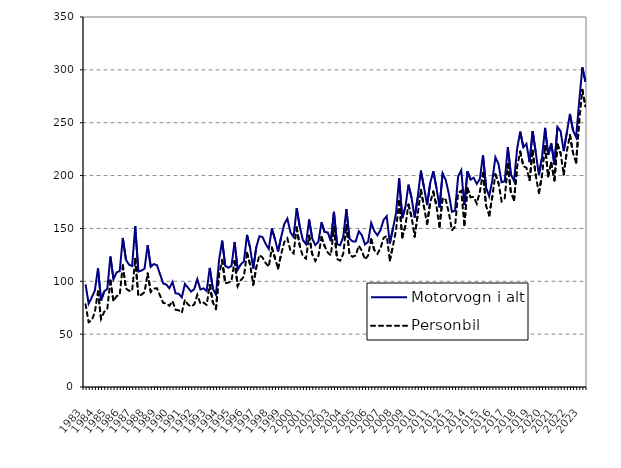
| Category | Motorvogn i alt | Personbil |
|---|---|---|
| 1983.0 | 97 | 78.3 |
| nan | 78.8 | 61.3 |
| nan | 84.8 | 63 |
| nan | 91.2 | 70.8 |
| 1984.0 | 112.2 | 90.4 |
| nan | 81.8 | 64.4 |
| nan | 90.4 | 71.1 |
| nan | 92.9 | 73.9 |
| 1985.0 | 123.4 | 100.8 |
| nan | 102 | 81.1 |
| nan | 108.4 | 86 |
| nan | 109.6 | 87.1 |
| 1986.0 | 141 | 115.2 |
| nan | 120.5 | 93.2 |
| nan | 115.7 | 91.1 |
| nan | 114.4 | 90.8 |
| 1987.0 | 152.2 | 121.3 |
| nan | 109.2 | 86.1 |
| nan | 110.1 | 87.3 |
| nan | 112 | 89.8 |
| 1988.0 | 134.1 | 107.5 |
| nan | 113.7 | 90 |
| nan | 116.3 | 93.1 |
| nan | 115.2 | 93.4 |
| 1989.0 | 106.6 | 86.4 |
| nan | 98 | 79.6 |
| nan | 96.9 | 79 |
| nan | 93.4 | 76.8 |
| 1990.0 | 99.4 | 81.3 |
| nan | 88.6 | 73.1 |
| nan | 88.2 | 72.5 |
| nan | 84.8 | 70.2 |
| 1991.0 | 97.5 | 82.4 |
| nan | 93.9 | 78 |
| nan | 90.2 | 76.1 |
| nan | 92.6 | 78.1 |
| 1992.0 | 102 | 87.1 |
| nan | 92.2 | 78.9 |
| nan | 93.3 | 79.9 |
| nan | 90.8 | 77.6 |
| 1993.0 | 112.6 | 96.5 |
| nan | 93 | 80.1 |
| nan | 87.5 | 73.6 |
| nan | 120.1 | 106.6 |
| 1994.0 | 138.4 | 120 |
| nan | 114.5 | 98.1 |
| nan | 112.8 | 98.8 |
| nan | 114.5 | 100.2 |
| 1995.0 | 137.2 | 119.3 |
| nan | 111 | 95.4 |
| nan | 115.9 | 101 |
| nan | 118.8 | 104.4 |
| 1996.0 | 143.9 | 126.9 |
| nan | 131.6 | 115.7 |
| nan | 112 | 96.7 |
| nan | 132.5 | 113.1 |
| 1997.0 | 142.6 | 124.8 |
| nan | 141.8 | 122.5 |
| nan | 135.4 | 117.3 |
| nan | 130.6 | 113.7 |
| 1998.0 | 150 | 131.9 |
| nan | 139.8 | 122 |
| nan | 128.1 | 112.1 |
| nan | 141.8 | 125.6 |
| 1999.0 | 154.2 | 137.1 |
| nan | 159.3 | 140.7 |
| nan | 146.3 | 128.7 |
| nan | 141.9 | 126.4 |
| 2000.0 | 169.1 | 150.9 |
| nan | 151.5 | 133.4 |
| nan | 139 | 123.5 |
| nan | 135.1 | 121.4 |
| 2001.0 | 158.5 | 143.1 |
| nan | 140.46 | 125.7 |
| nan | 134.24 | 119.2 |
| nan | 137.495 | 124.072 |
| 2002.0 | 155.814 | 141.724 |
| nan | 146.543 | 133.19 |
| nan | 146.231 | 127.141 |
| nan | 137.967 | 124.641 |
| 2003.0 | 165.679 | 150.811 |
| nan | 135.021 | 121.101 |
| nan | 134.111 | 119.491 |
| nan | 142.013 | 125.959 |
| 2004.0 | 168.309 | 153.043 |
| nan | 140.267 | 125.568 |
| nan | 137.77 | 123.121 |
| nan | 137.685 | 124.506 |
| 2005.0 | 147.311 | 133.756 |
| nan | 143.517 | 128.79 |
| nan | 134.783 | 120.571 |
| nan | 137.37 | 124.382 |
| 2006.0 | 155.213 | 139.728 |
| nan | 147.444 | 129.572 |
| nan | 143.451 | 126.006 |
| nan | 148.561 | 131.195 |
| 2007.0 | 158.1 | 141.084 |
| nan | 161.613 | 142.897 |
| nan | 135.821 | 119.753 |
| nan | 149.791 | 133.498 |
| 2008.0 | 164.642 | 148.614 |
| nan | 197.287 | 175.714 |
| nan | 159.718 | 141.407 |
| nan | 170.057 | 152.54 |
| 2009.0 | 191.38 | 172.559 |
| nan | 178.906 | 160.765 |
| nan | 160.234 | 142.312 |
| nan | 179.857 | 163.532 |
| 2010.0 | 204.636 | 186.507 |
| nan | 188.957 | 170.463 |
| nan | 172.077 | 154.156 |
| nan | 192.961 | 174.399 |
| 2011.0 | 204.005 | 184.86 |
| nan | 188.741 | 171.333 |
| nan | 169.934 | 151.694 |
| nan | 202.176 | 178.919 |
| 2012.0 | 195.829 | 177.072 |
| nan | 182.751 | 165.128 |
| nan | 165.73 | 148.242 |
| nan | 166.805 | 151.728 |
| 2013.0 | 199.181 | 183.653 |
| nan | 205.015 | 185.634 |
| nan | 172.044 | 153.21 |
| nan | 204.1 | 188.079 |
| 2014.0 | 196.177 | 179.552 |
| nan | 197.965 | 179.767 |
| nan | 192.105 | 173.474 |
| nan | 196.809 | 184.739 |
| 2015.0 | 219.419 | 202.592 |
| nan | 188.696 | 171.451 |
| nan | 180.388 | 162.297 |
| nan | 195.23 | 179.891 |
| 2016.0 | 217.298 | 201.197 |
| nan | 210.949 | 192.893 |
| nan | 193.648 | 175.642 |
| nan | 194.663 | 178.455 |
| 2017.0 | 227.029 | 210.738 |
| nan | 200.767 | 183.708 |
| nan | 195.059 | 176.766 |
| nan | 225.423 | 208.218 |
| 2018.0 | 241.528 | 222.678 |
| nan | 226.771 | 208.839 |
| nan | 230.044 | 207.395 |
| nan | 212.667 | 195.666 |
| 2019.0 | 242.056 | 223.584 |
| nan | 221.711 | 199.972 |
| nan | 200.668 | 183.518 |
| nan | 216.92 | 199.72 |
| 2020.0 | 245.163 | 227.947 |
| nan | 219.434 | 199.239 |
| nan | 230.409 | 212.039 |
| nan | 210.538 | 195.423 |
| 2021.0 | 246.037 | 229.482 |
| nan | 241.941 | 221.096 |
| nan | 223.162 | 200.95 |
| nan | 240.674 | 222.834 |
| 2022.0 | 258.319 | 238.379 |
| nan | 242.592 | 221.267 |
| nan | 236.373 | 212.275 |
| nan | 270.368 | 251.769 |
| 2023.0 | 302.388 | 281.084 |
| nan | 288.712 | 265.488 |